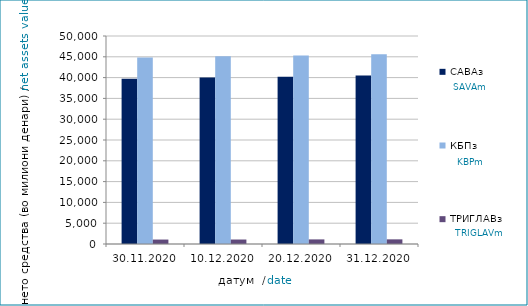
| Category | САВАз | КБПз | ТРИГЛАВз |
|---|---|---|---|
| 2020-11-30 | 39740.232 | 44803.335 | 1067.235 |
| 2020-12-10 | 39997.524 | 45126.918 | 1076.387 |
| 2020-12-20 | 40213.098 | 45319.459 | 1105.686 |
| 2020-12-31 | 40500.916 | 45638.471 | 1117.707 |